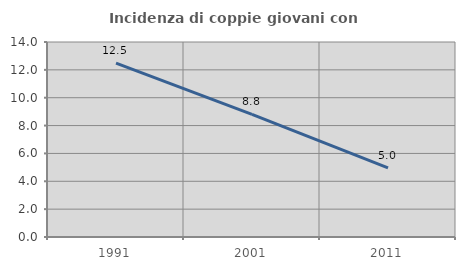
| Category | Incidenza di coppie giovani con figli |
|---|---|
| 1991.0 | 12.478 |
| 2001.0 | 8.803 |
| 2011.0 | 4.957 |